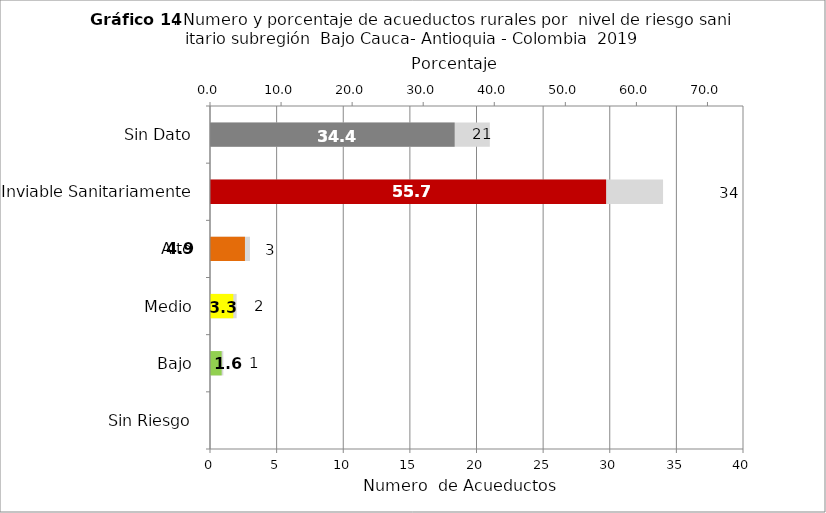
| Category | Número de Sistemas |
|---|---|
| Sin Riesgo | 0 |
| Bajo | 1 |
| Medio | 2 |
| Alto | 3 |
| Inviable Sanitariamente | 34 |
| Sin Dato | 21 |